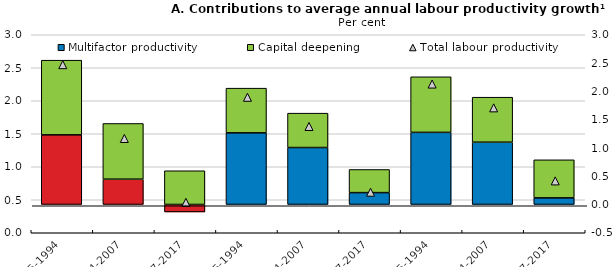
| Category | Multifactor productivity | Capital deepening |
|---|---|---|
| 1985-1994 | 1.231 | 1.32 |
| 1994-2007 | 0.447 | 0.985 |
| 2007-2017 | -0.132 | 0.596 |
| 1985-1994 | 1.266 | 0.79 |
| 1994-2007 | 1.007 | 0.608 |
| 2007-2017 | 0.209 | 0.409 |
| 1985-1994 | 1.274 | 0.982 |
| 1994-2007 | 1.101 | 0.795 |
| 2007-2017 | 0.117 | 0.673 |